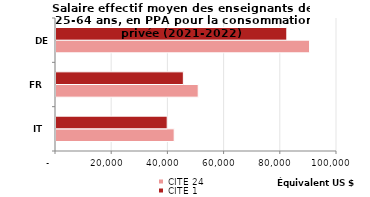
| Category | CITE 24 | CITE 1 |
|---|---|---|
| IT | 42055 | 39569 |
| FR | 50609 | 45320 |
| DE | 90235 | 82145 |